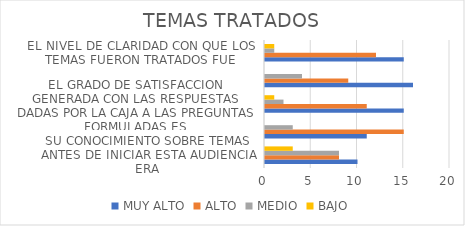
| Category | MUY ALTO | ALTO | MEDIO | BAJO |
|---|---|---|---|---|
| SU CONOCIMIENTO SOBRE TEMAS ANTES DE INICIAR ESTA AUDIENCIA ERA | 10 | 8 | 8 | 3 |
| SU CONOCIMIENTO SOBRE TEMAS DESPUES DE FINANLIZAR LA AUDIENCIA ES | 11 | 15 | 3 | 0 |
| EL GRADO DE SATISFACCION GENERADA CON LAS RESPUESTAS DADAS POR LA CAJA A LAS PREGUNTAS FORMULADAS ES | 15 | 11 | 2 | 1 |
| EL NIVEL DE CALIFICACION QUE USTED OTORGA A LA CALIDAD DEL CONTENIDO EN LOS TEMAS TRATADOS ES | 16 | 9 | 4 | 0 |
| EL NIVEL DE CLARIDAD CON QUE LOS TEMAS FUERON TRATADOS FUE | 15 | 12 | 1 | 1 |